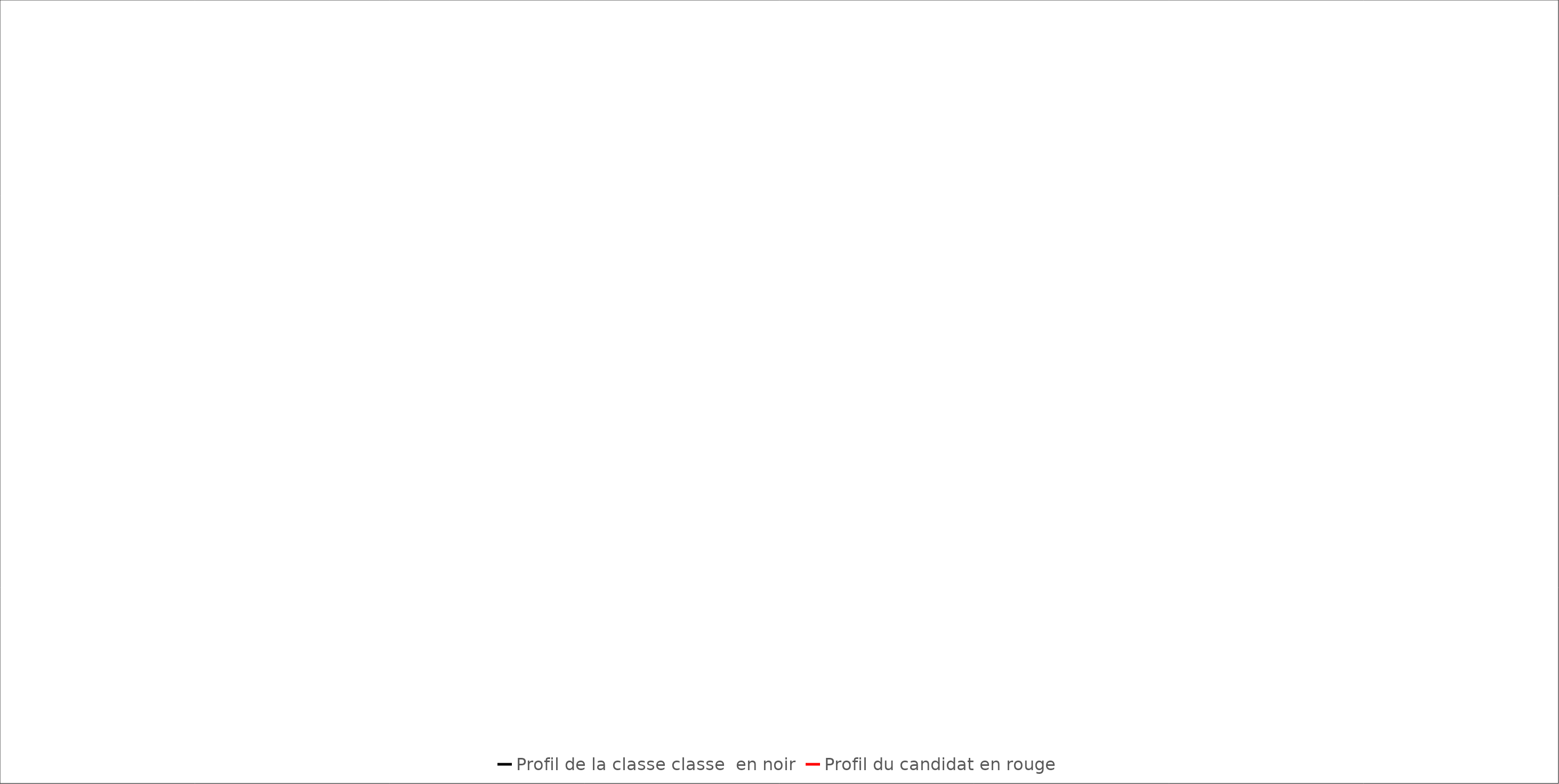
| Category | Profil de la classe classe  en noir | Profil du candidat en rouge |
|---|---|---|
| Culture générale et expression | 0 | 0 |
| Langue vivante étrangère 1 : anglais | 0 | 0 |
| Langue vivante étrangère 2 | 0 | 0 |
| Culture économique, juridique et managériale | 0 | 0 |
| Relation commerciale interculturelle | 0 | 0 |
| Relation commerciale interculturelle en anglais et en économie-gestion (co-intervention) | 0 | 0 |
| Mise en œuvre des opérations internationales | 0 | 0 |
| Développement commercial international | 0 | 0 |
| EF1Langue vivante étrangère 3 | 0 | 0 |
| EF2 Préparation et suivi de césure | 0 | 0 |